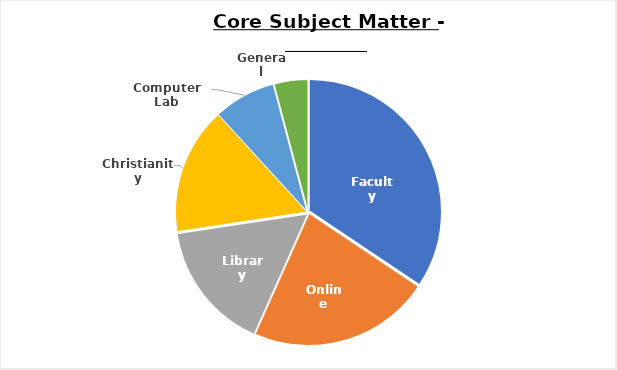
| Category | Series 0 |
|---|---|
| Faculty | 108 |
| Online | 70 |
| Library | 50 |
| Christianity | 49 |
| Computer Lab | 24 |
| General | 13 |